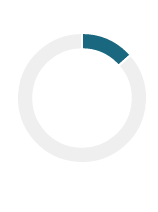
| Category | Series 0 |
|---|---|
| 0 | 0.135 |
| 1 | 0.865 |